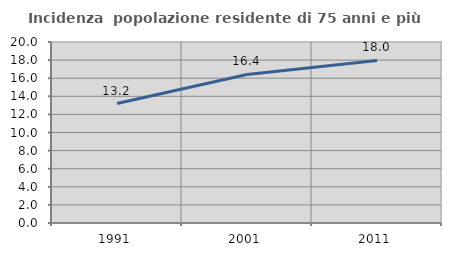
| Category | Incidenza  popolazione residente di 75 anni e più |
|---|---|
| 1991.0 | 13.202 |
| 2001.0 | 16.411 |
| 2011.0 | 17.958 |